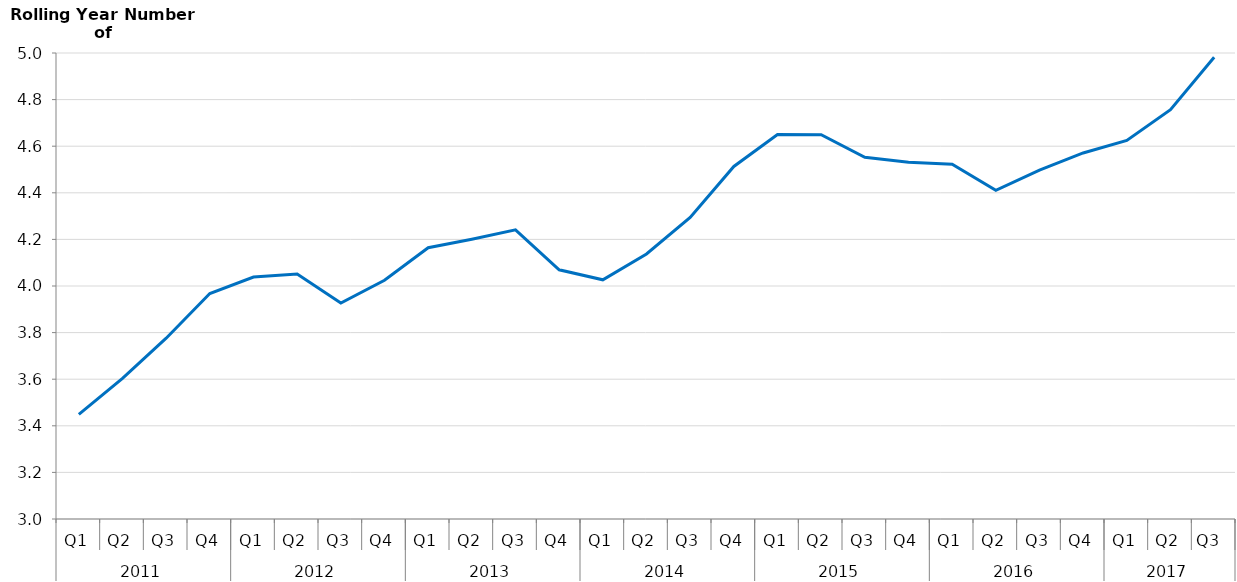
| Category | Rolling Year Overnight Trips  |
|---|---|
| 0 | 3449234.585 |
| 1 | 3603503.025 |
| 2 | 3776061.835 |
| 3 | 3967762.023 |
| 4 | 4038429.282 |
| 5 | 4051615.143 |
| 6 | 3926598.037 |
| 7 | 4024504.999 |
| 8 | 4164220.885 |
| 9 | 4200581.796 |
| 10 | 4241056.555 |
| 11 | 4069440.424 |
| 12 | 4026459.687 |
| 13 | 4137374.729 |
| 14 | 4294428.3 |
| 15 | 4513146.4 |
| 16 | 4649933.446 |
| 17 | 4649322.249 |
| 18 | 4552115.024 |
| 19 | 4531617.984 |
| 20 | 4522878.299 |
| 21 | 4410785.417 |
| 22 | 4497516.255 |
| 23 | 4571100.408 |
| 24 | 4624515.212 |
| 25 | 4756597.238 |
| 26 | 4981461.297 |